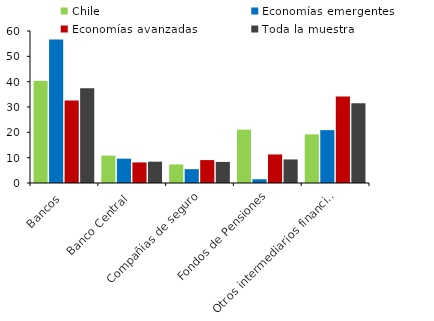
| Category | Chile | Economías emergentes | Economías avanzadas | Toda la muestra |
|---|---|---|---|---|
| Bancos | 40.358 | 56.602 | 32.543 | 37.372 |
| Banco Central | 10.826 | 9.6 | 8.118 | 8.416 |
| Compañias de seguro | 7.32 | 5.462 | 9.042 | 8.323 |
| Fondos de Pensiones | 21.061 | 1.478 | 11.268 | 9.303 |
| Otros intermediarios financieros (*) | 19.209 | 20.865 | 34.182 | 31.509 |